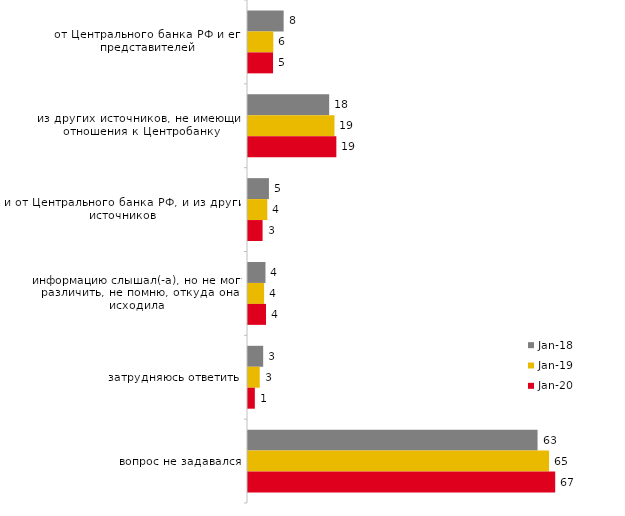
| Category | янв.18 | янв.19 | янв.20 |
|---|---|---|---|
| от Центрального банка РФ и его представителей | 7.75 | 5.5 | 5.446 |
| из других источников, не имеющих отношения к Центробанку | 17.65 | 18.8 | 19.208 |
| и от Центрального банка РФ, и из других источников | 4.55 | 4.2 | 3.168 |
| информацию слышал(-а), но не могу различить, не помню, откуда она исходила | 3.8 | 3.5 | 3.911 |
| затрудняюсь ответить | 3.3 | 2.55 | 1.485 |
| вопрос не задавался | 62.95 | 65.45 | 66.782 |